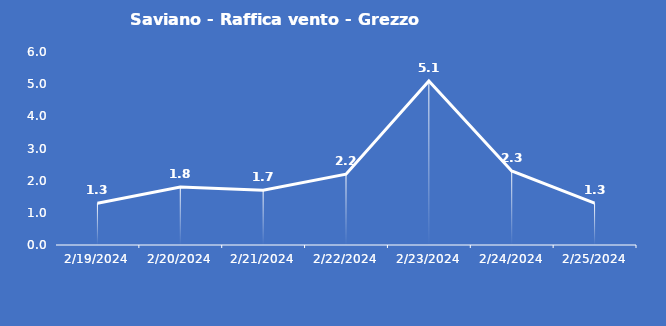
| Category | Saviano - Raffica vento - Grezzo (m/s) |
|---|---|
| 2/19/24 | 1.3 |
| 2/20/24 | 1.8 |
| 2/21/24 | 1.7 |
| 2/22/24 | 2.2 |
| 2/23/24 | 5.1 |
| 2/24/24 | 2.3 |
| 2/25/24 | 1.3 |